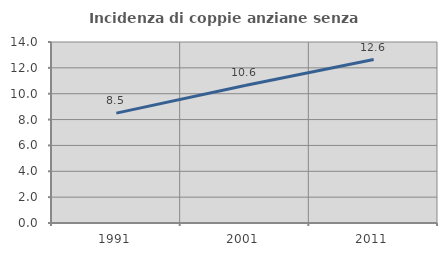
| Category | Incidenza di coppie anziane senza figli  |
|---|---|
| 1991.0 | 8.498 |
| 2001.0 | 10.638 |
| 2011.0 | 12.639 |